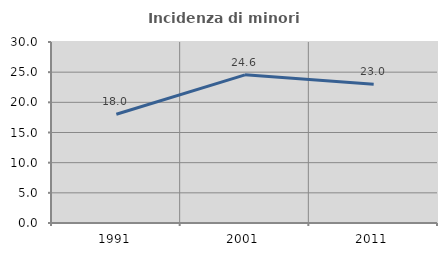
| Category | Incidenza di minori stranieri |
|---|---|
| 1991.0 | 18.033 |
| 2001.0 | 24.556 |
| 2011.0 | 22.996 |